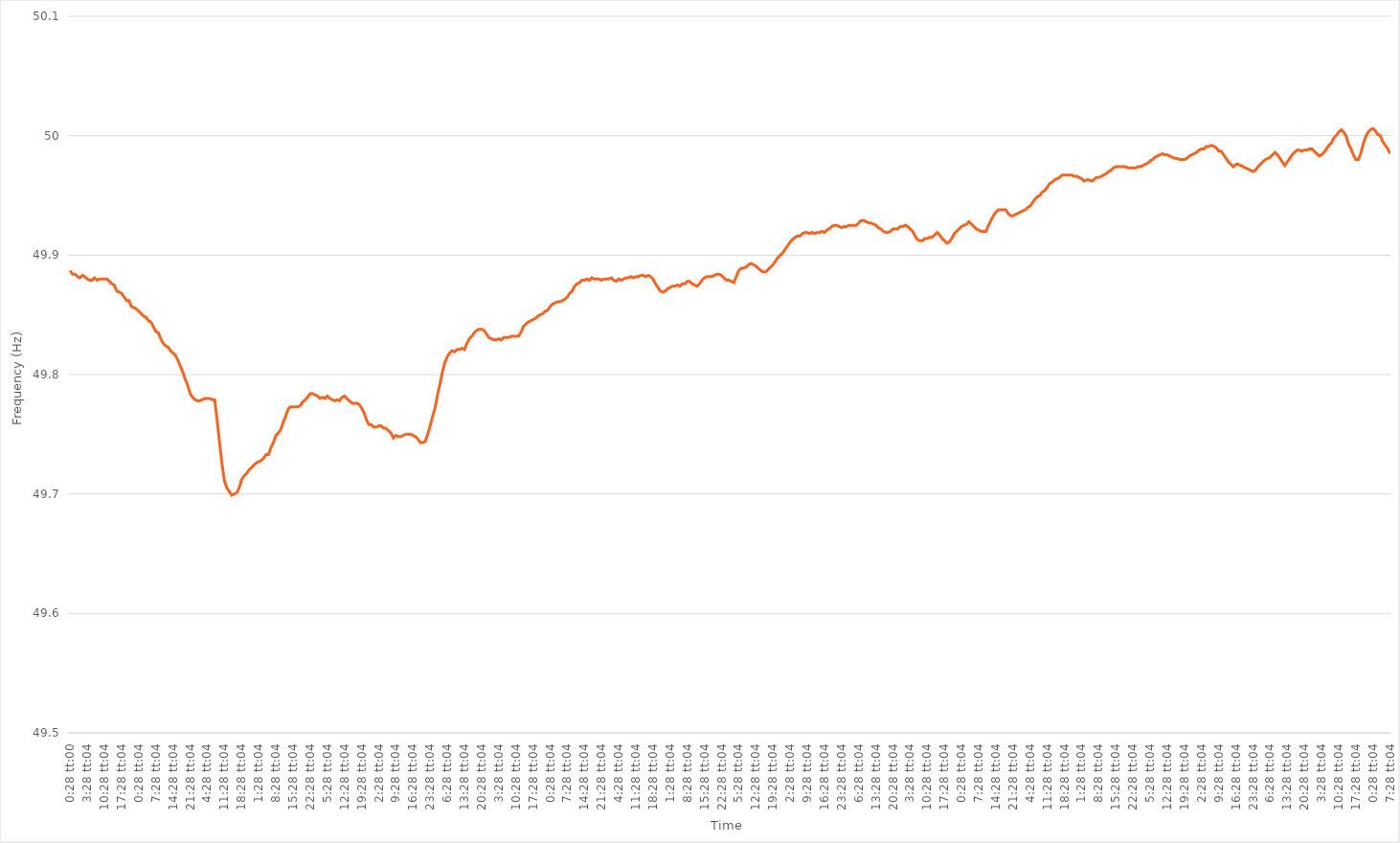
| Category | Series 0 |
|---|---|
| 0.019444444444444445 | 49.887 |
| 0.01945601851851852 | 49.884 |
| 0.019467592592592595 | 49.884 |
| 0.01947916666666667 | 49.882 |
| 0.019490740740740743 | 49.881 |
| 0.0611574074074074 | 49.883 |
| 0.102824074074074 | 49.882 |
| 0.144490740740741 | 49.88 |
| 0.186157407407407 | 49.879 |
| 0.227824074074074 | 49.879 |
| 0.269490740740741 | 49.881 |
| 0.311157407407407 | 49.879 |
| 0.352824074074074 | 49.88 |
| 0.394490740740741 | 49.88 |
| 0.436157407407407 | 49.88 |
| 0.477824074074074 | 49.88 |
| 0.519490740740741 | 49.878 |
| 0.561157407407407 | 49.876 |
| 0.602824074074074 | 49.875 |
| 0.644490740740741 | 49.87 |
| 0.686157407407407 | 49.869 |
| 0.727824074074074 | 49.868 |
| 0.769490740740741 | 49.865 |
| 0.811157407407407 | 49.862 |
| 0.852824074074074 | 49.862 |
| 0.894490740740741 | 49.857 |
| 0.936157407407407 | 49.856 |
| 0.977824074074074 | 49.855 |
| 1900-01-01 00:28:04 | 49.853 |
| 1900-01-01 01:28:04 | 49.851 |
| 1900-01-01 02:28:04 | 49.849 |
| 1900-01-01 03:28:04 | 49.848 |
| 1900-01-01 04:28:04 | 49.845 |
| 1900-01-01 05:28:04 | 49.844 |
| 1900-01-01 06:28:04 | 49.84 |
| 1900-01-01 07:28:04 | 49.836 |
| 1900-01-01 08:28:04 | 49.835 |
| 1900-01-01 09:28:04 | 49.83 |
| 1900-01-01 10:28:04 | 49.826 |
| 1900-01-01 11:28:04 | 49.824 |
| 1900-01-01 12:28:04 | 49.823 |
| 1900-01-01 13:28:04 | 49.82 |
| 1900-01-01 14:28:04 | 49.818 |
| 1900-01-01 15:28:04 | 49.816 |
| 1900-01-01 16:28:04 | 49.812 |
| 1900-01-01 17:28:04 | 49.807 |
| 1900-01-01 18:28:04 | 49.802 |
| 1900-01-01 19:28:04 | 49.796 |
| 1900-01-01 20:28:04 | 49.791 |
| 1900-01-01 21:28:04 | 49.784 |
| 1900-01-01 22:28:04 | 49.781 |
| 1900-01-01 23:28:04 | 49.779 |
| 1900-01-02 00:28:04 | 49.778 |
| 1900-01-02 01:28:04 | 49.778 |
| 1900-01-02 02:28:04 | 49.779 |
| 1900-01-02 03:28:04 | 49.78 |
| 1900-01-02 04:28:04 | 49.78 |
| 1900-01-02 05:28:04 | 49.78 |
| 1900-01-02 06:28:04 | 49.779 |
| 1900-01-02 07:28:04 | 49.779 |
| 1900-01-02 08:28:04 | 49.762 |
| 1900-01-02 09:28:04 | 49.743 |
| 1900-01-02 10:28:04 | 49.725 |
| 1900-01-02 11:28:04 | 49.711 |
| 1900-01-02 12:28:04 | 49.705 |
| 1900-01-02 13:28:04 | 49.702 |
| 1900-01-02 14:28:04 | 49.699 |
| 1900-01-02 15:28:04 | 49.7 |
| 1900-01-02 16:28:04 | 49.701 |
| 1900-01-02 17:28:04 | 49.705 |
| 1900-01-02 18:28:04 | 49.712 |
| 1900-01-02 19:28:04 | 49.715 |
| 1900-01-02 20:28:04 | 49.717 |
| 1900-01-02 21:28:04 | 49.72 |
| 1900-01-02 22:28:04 | 49.722 |
| 1900-01-02 23:28:04 | 49.724 |
| 1900-01-03 00:28:04 | 49.726 |
| 1900-01-03 01:28:04 | 49.727 |
| 1900-01-03 02:28:04 | 49.728 |
| 1900-01-03 03:28:04 | 49.73 |
| 1900-01-03 04:28:04 | 49.733 |
| 1900-01-03 05:28:04 | 49.733 |
| 1900-01-03 06:28:04 | 49.739 |
| 1900-01-03 07:28:04 | 49.743 |
| 1900-01-03 08:28:04 | 49.749 |
| 1900-01-03 09:28:04 | 49.751 |
| 1900-01-03 10:28:04 | 49.754 |
| 1900-01-03 11:28:04 | 49.76 |
| 1900-01-03 12:28:04 | 49.765 |
| 1900-01-03 13:28:04 | 49.771 |
| 1900-01-03 14:28:04 | 49.773 |
| 1900-01-03 15:28:04 | 49.773 |
| 1900-01-03 16:28:04 | 49.773 |
| 1900-01-03 17:28:04 | 49.773 |
| 1900-01-03 18:28:04 | 49.774 |
| 1900-01-03 19:28:04 | 49.777 |
| 1900-01-03 20:28:04 | 49.779 |
| 1900-01-03 21:28:04 | 49.781 |
| 1900-01-03 22:28:04 | 49.784 |
| 1900-01-03 23:28:04 | 49.784 |
| 1900-01-04 00:28:04 | 49.783 |
| 1900-01-04 01:28:04 | 49.782 |
| 1900-01-04 02:28:04 | 49.78 |
| 1900-01-04 03:28:04 | 49.781 |
| 1900-01-04 04:28:04 | 49.78 |
| 1900-01-04 05:28:04 | 49.782 |
| 1900-01-04 06:28:04 | 49.78 |
| 1900-01-04 07:28:04 | 49.779 |
| 1900-01-04 08:28:04 | 49.778 |
| 1900-01-04 09:28:04 | 49.779 |
| 1900-01-04 10:28:04 | 49.778 |
| 1900-01-04 11:28:04 | 49.781 |
| 1900-01-04 12:28:04 | 49.782 |
| 1900-01-04 13:28:04 | 49.78 |
| 1900-01-04 14:28:04 | 49.778 |
| 1900-01-04 15:28:04 | 49.776 |
| 1900-01-04 16:28:04 | 49.776 |
| 1900-01-04 17:28:04 | 49.776 |
| 1900-01-04 18:28:04 | 49.775 |
| 1900-01-04 19:28:04 | 49.772 |
| 1900-01-04 20:28:04 | 49.768 |
| 1900-01-04 21:28:04 | 49.762 |
| 1900-01-04 22:28:04 | 49.758 |
| 1900-01-04 23:28:04 | 49.758 |
| 1900-01-05 00:28:04 | 49.756 |
| 1900-01-05 01:28:04 | 49.756 |
| 1900-01-05 02:28:04 | 49.757 |
| 1900-01-05 03:28:04 | 49.757 |
| 1900-01-05 04:28:04 | 49.755 |
| 1900-01-05 05:28:04 | 49.755 |
| 1900-01-05 06:28:04 | 49.753 |
| 1900-01-05 07:28:04 | 49.751 |
| 1900-01-05 08:28:04 | 49.747 |
| 1900-01-05 09:28:04 | 49.749 |
| 1900-01-05 10:28:04 | 49.748 |
| 1900-01-05 11:28:04 | 49.748 |
| 1900-01-05 12:28:04 | 49.749 |
| 1900-01-05 13:28:04 | 49.75 |
| 1900-01-05 14:28:04 | 49.75 |
| 1900-01-05 15:28:04 | 49.75 |
| 1900-01-05 16:28:04 | 49.749 |
| 1900-01-05 17:28:04 | 49.748 |
| 1900-01-05 18:28:04 | 49.746 |
| 1900-01-05 19:28:04 | 49.743 |
| 1900-01-05 20:28:04 | 49.743 |
| 1900-01-05 21:28:04 | 49.744 |
| 1900-01-05 22:28:04 | 49.75 |
| 1900-01-05 23:28:04 | 49.757 |
| 1900-01-06 00:28:04 | 49.765 |
| 1900-01-06 01:28:04 | 49.772 |
| 1900-01-06 02:28:04 | 49.783 |
| 1900-01-06 03:28:04 | 49.792 |
| 1900-01-06 04:28:04 | 49.802 |
| 1900-01-06 05:28:04 | 49.81 |
| 1900-01-06 06:28:04 | 49.815 |
| 1900-01-06 07:28:04 | 49.818 |
| 1900-01-06 08:28:04 | 49.82 |
| 1900-01-06 09:28:04 | 49.819 |
| 1900-01-06 10:28:04 | 49.821 |
| 1900-01-06 11:28:04 | 49.821 |
| 1900-01-06 12:28:04 | 49.822 |
| 1900-01-06 13:28:04 | 49.821 |
| 1900-01-06 14:28:04 | 49.826 |
| 1900-01-06 15:28:04 | 49.83 |
| 1900-01-06 16:28:04 | 49.832 |
| 1900-01-06 17:28:04 | 49.835 |
| 1900-01-06 18:28:04 | 49.837 |
| 1900-01-06 19:28:04 | 49.838 |
| 1900-01-06 20:28:04 | 49.838 |
| 1900-01-06 21:28:04 | 49.837 |
| 1900-01-06 22:28:04 | 49.834 |
| 1900-01-06 23:28:04 | 49.831 |
| 1900-01-07 00:28:04 | 49.83 |
| 1900-01-07 01:28:04 | 49.829 |
| 1900-01-07 02:28:04 | 49.829 |
| 1900-01-07 03:28:04 | 49.83 |
| 1900-01-07 04:28:04 | 49.829 |
| 1900-01-07 05:28:04 | 49.831 |
| 1900-01-07 06:28:04 | 49.831 |
| 1900-01-07 07:28:04 | 49.831 |
| 1900-01-07 08:28:04 | 49.832 |
| 1900-01-07 09:28:04 | 49.832 |
| 1900-01-07 10:28:04 | 49.832 |
| 1900-01-07 11:28:04 | 49.832 |
| 1900-01-07 12:28:04 | 49.835 |
| 1900-01-07 13:28:04 | 49.84 |
| 1900-01-07 14:28:04 | 49.842 |
| 1900-01-07 15:28:04 | 49.844 |
| 1900-01-07 16:28:04 | 49.845 |
| 1900-01-07 17:28:04 | 49.846 |
| 1900-01-07 18:28:04 | 49.847 |
| 1900-01-07 19:28:04 | 49.849 |
| 1900-01-07 20:28:04 | 49.85 |
| 1900-01-07 21:28:04 | 49.851 |
| 1900-01-07 22:28:04 | 49.853 |
| 1900-01-07 23:28:04 | 49.854 |
| 1900-01-08 00:28:04 | 49.857 |
| 1900-01-08 01:28:04 | 49.859 |
| 1900-01-08 02:28:04 | 49.86 |
| 1900-01-08 03:28:04 | 49.861 |
| 1900-01-08 04:28:04 | 49.861 |
| 1900-01-08 05:28:04 | 49.862 |
| 1900-01-08 06:28:04 | 49.863 |
| 1900-01-08 07:28:04 | 49.865 |
| 1900-01-08 08:28:04 | 49.868 |
| 1900-01-08 09:28:04 | 49.87 |
| 1900-01-08 10:28:04 | 49.874 |
| 1900-01-08 11:28:04 | 49.876 |
| 1900-01-08 12:28:04 | 49.877 |
| 1900-01-08 13:28:04 | 49.879 |
| 1900-01-08 14:28:04 | 49.879 |
| 1900-01-08 15:28:04 | 49.88 |
| 1900-01-08 16:28:04 | 49.879 |
| 1900-01-08 17:28:04 | 49.881 |
| 1900-01-08 18:28:04 | 49.88 |
| 1900-01-08 19:28:04 | 49.88 |
| 1900-01-08 20:28:04 | 49.88 |
| 1900-01-08 21:28:04 | 49.879 |
| 1900-01-08 22:28:04 | 49.88 |
| 1900-01-08 23:28:04 | 49.88 |
| 1900-01-09 00:28:04 | 49.88 |
| 1900-01-09 01:28:04 | 49.881 |
| 1900-01-09 02:28:04 | 49.879 |
| 1900-01-09 03:28:04 | 49.878 |
| 1900-01-09 04:28:04 | 49.88 |
| 1900-01-09 05:28:04 | 49.879 |
| 1900-01-09 06:28:04 | 49.88 |
| 1900-01-09 07:28:04 | 49.881 |
| 1900-01-09 08:28:04 | 49.881 |
| 1900-01-09 09:28:04 | 49.882 |
| 1900-01-09 10:28:04 | 49.881 |
| 1900-01-09 11:28:04 | 49.882 |
| 1900-01-09 12:28:04 | 49.882 |
| 1900-01-09 13:28:04 | 49.883 |
| 1900-01-09 14:28:04 | 49.883 |
| 1900-01-09 15:28:04 | 49.882 |
| 1900-01-09 16:28:04 | 49.883 |
| 1900-01-09 17:28:04 | 49.882 |
| 1900-01-09 18:28:04 | 49.88 |
| 1900-01-09 19:28:04 | 49.876 |
| 1900-01-09 20:28:04 | 49.873 |
| 1900-01-09 21:28:04 | 49.87 |
| 1900-01-09 22:28:04 | 49.869 |
| 1900-01-09 23:28:04 | 49.87 |
| 1900-01-10 00:28:04 | 49.872 |
| 1900-01-10 01:28:04 | 49.873 |
| 1900-01-10 02:28:04 | 49.874 |
| 1900-01-10 03:28:04 | 49.874 |
| 1900-01-10 04:28:04 | 49.875 |
| 1900-01-10 05:28:04 | 49.874 |
| 1900-01-10 06:28:04 | 49.876 |
| 1900-01-10 07:28:04 | 49.876 |
| 1900-01-10 08:28:04 | 49.878 |
| 1900-01-10 09:28:04 | 49.878 |
| 1900-01-10 10:28:04 | 49.876 |
| 1900-01-10 11:28:04 | 49.875 |
| 1900-01-10 12:28:04 | 49.874 |
| 1900-01-10 13:28:04 | 49.876 |
| 1900-01-10 14:28:04 | 49.879 |
| 1900-01-10 15:28:04 | 49.881 |
| 1900-01-10 16:28:04 | 49.882 |
| 1900-01-10 17:28:04 | 49.882 |
| 1900-01-10 18:28:04 | 49.882 |
| 1900-01-10 19:28:04 | 49.883 |
| 1900-01-10 20:28:04 | 49.884 |
| 1900-01-10 21:28:04 | 49.884 |
| 1900-01-10 22:28:04 | 49.883 |
| 1900-01-10 23:28:04 | 49.881 |
| 1900-01-11 00:28:04 | 49.879 |
| 1900-01-11 01:28:04 | 49.879 |
| 1900-01-11 02:28:04 | 49.878 |
| 1900-01-11 03:28:04 | 49.877 |
| 1900-01-11 04:28:04 | 49.882 |
| 1900-01-11 05:28:04 | 49.887 |
| 1900-01-11 06:28:04 | 49.889 |
| 1900-01-11 07:28:04 | 49.889 |
| 1900-01-11 08:28:04 | 49.89 |
| 1900-01-11 09:28:04 | 49.892 |
| 1900-01-11 10:28:04 | 49.893 |
| 1900-01-11 11:28:04 | 49.892 |
| 1900-01-11 12:28:04 | 49.891 |
| 1900-01-11 13:28:04 | 49.889 |
| 1900-01-11 14:28:04 | 49.887 |
| 1900-01-11 15:28:04 | 49.886 |
| 1900-01-11 16:28:04 | 49.886 |
| 1900-01-11 17:28:04 | 49.888 |
| 1900-01-11 18:28:04 | 49.89 |
| 1900-01-11 19:28:04 | 49.892 |
| 1900-01-11 20:28:04 | 49.895 |
| 1900-01-11 21:28:04 | 49.898 |
| 1900-01-11 22:28:04 | 49.9 |
| 1900-01-11 23:28:04 | 49.902 |
| 1900-01-12 00:28:04 | 49.905 |
| 1900-01-12 01:28:04 | 49.908 |
| 1900-01-12 02:28:04 | 49.911 |
| 1900-01-12 03:28:04 | 49.913 |
| 1900-01-12 04:28:04 | 49.915 |
| 1900-01-12 05:28:04 | 49.916 |
| 1900-01-12 06:28:04 | 49.916 |
| 1900-01-12 07:28:04 | 49.918 |
| 1900-01-12 08:28:04 | 49.919 |
| 1900-01-12 09:28:04 | 49.919 |
| 1900-01-12 10:28:04 | 49.918 |
| 1900-01-12 11:28:04 | 49.919 |
| 1900-01-12 12:28:04 | 49.918 |
| 1900-01-12 13:28:04 | 49.919 |
| 1900-01-12 14:28:04 | 49.919 |
| 1900-01-12 15:28:04 | 49.92 |
| 1900-01-12 16:28:04 | 49.919 |
| 1900-01-12 17:28:04 | 49.921 |
| 1900-01-12 18:28:04 | 49.922 |
| 1900-01-12 19:28:04 | 49.924 |
| 1900-01-12 20:28:04 | 49.925 |
| 1900-01-12 21:28:04 | 49.925 |
| 1900-01-12 22:28:04 | 49.924 |
| 1900-01-12 23:28:04 | 49.923 |
| 1900-01-13 00:28:04 | 49.924 |
| 1900-01-13 01:28:04 | 49.924 |
| 1900-01-13 02:28:04 | 49.925 |
| 1900-01-13 03:28:04 | 49.925 |
| 1900-01-13 04:28:04 | 49.925 |
| 1900-01-13 05:28:04 | 49.925 |
| 1900-01-13 06:28:04 | 49.927 |
| 1900-01-13 07:28:04 | 49.929 |
| 1900-01-13 08:28:04 | 49.929 |
| 1900-01-13 09:28:04 | 49.928 |
| 1900-01-13 10:28:04 | 49.927 |
| 1900-01-13 11:28:04 | 49.927 |
| 1900-01-13 12:28:04 | 49.926 |
| 1900-01-13 13:28:04 | 49.925 |
| 1900-01-13 14:28:04 | 49.923 |
| 1900-01-13 15:28:04 | 49.922 |
| 1900-01-13 16:28:04 | 49.92 |
| 1900-01-13 17:28:04 | 49.919 |
| 1900-01-13 18:28:04 | 49.919 |
| 1900-01-13 19:28:04 | 49.92 |
| 1900-01-13 20:28:04 | 49.922 |
| 1900-01-13 21:28:04 | 49.922 |
| 1900-01-13 22:28:04 | 49.922 |
| 1900-01-13 23:28:04 | 49.924 |
| 1900-01-14 00:28:04 | 49.924 |
| 1900-01-14 01:28:04 | 49.925 |
| 1900-01-14 02:28:04 | 49.924 |
| 1900-01-14 03:28:04 | 49.922 |
| 1900-01-14 04:28:04 | 49.92 |
| 1900-01-14 05:28:04 | 49.916 |
| 1900-01-14 06:28:04 | 49.913 |
| 1900-01-14 07:28:04 | 49.912 |
| 1900-01-14 08:28:04 | 49.912 |
| 1900-01-14 09:28:04 | 49.914 |
| 1900-01-14 10:28:04 | 49.914 |
| 1900-01-14 11:28:04 | 49.915 |
| 1900-01-14 12:28:04 | 49.915 |
| 1900-01-14 13:28:04 | 49.917 |
| 1900-01-14 14:28:04 | 49.919 |
| 1900-01-14 15:28:04 | 49.917 |
| 1900-01-14 16:28:04 | 49.914 |
| 1900-01-14 17:28:04 | 49.912 |
| 1900-01-14 18:28:04 | 49.91 |
| 1900-01-14 19:28:04 | 49.911 |
| 1900-01-14 20:28:04 | 49.914 |
| 1900-01-14 21:28:04 | 49.918 |
| 1900-01-14 22:28:04 | 49.92 |
| 1900-01-14 23:28:04 | 49.922 |
| 1900-01-15 00:28:04 | 49.924 |
| 1900-01-15 01:28:04 | 49.925 |
| 1900-01-15 02:28:04 | 49.926 |
| 1900-01-15 03:28:04 | 49.928 |
| 1900-01-15 04:28:04 | 49.926 |
| 1900-01-15 05:28:04 | 49.924 |
| 1900-01-15 06:28:04 | 49.922 |
| 1900-01-15 07:28:04 | 49.921 |
| 1900-01-15 08:28:04 | 49.92 |
| 1900-01-15 09:28:04 | 49.92 |
| 1900-01-15 10:28:04 | 49.92 |
| 1900-01-15 11:28:04 | 49.925 |
| 1900-01-15 12:28:04 | 49.929 |
| 1900-01-15 13:28:04 | 49.933 |
| 1900-01-15 14:28:04 | 49.936 |
| 1900-01-15 15:28:04 | 49.938 |
| 1900-01-15 16:28:04 | 49.938 |
| 1900-01-15 17:28:04 | 49.938 |
| 1900-01-15 18:28:04 | 49.938 |
| 1900-01-15 19:28:04 | 49.935 |
| 1900-01-15 20:28:04 | 49.933 |
| 1900-01-15 21:28:04 | 49.933 |
| 1900-01-15 22:28:04 | 49.934 |
| 1900-01-15 23:28:04 | 49.935 |
| 1900-01-16 00:28:04 | 49.936 |
| 1900-01-16 01:28:04 | 49.937 |
| 1900-01-16 02:28:04 | 49.938 |
| 1900-01-16 03:28:04 | 49.94 |
| 1900-01-16 04:28:04 | 49.941 |
| 1900-01-16 05:28:04 | 49.944 |
| 1900-01-16 06:28:04 | 49.947 |
| 1900-01-16 07:28:04 | 49.949 |
| 1900-01-16 08:28:04 | 49.95 |
| 1900-01-16 09:28:04 | 49.953 |
| 1900-01-16 10:28:04 | 49.954 |
| 1900-01-16 11:28:04 | 49.957 |
| 1900-01-16 12:28:04 | 49.96 |
| 1900-01-16 13:28:04 | 49.961 |
| 1900-01-16 14:28:04 | 49.963 |
| 1900-01-16 15:28:04 | 49.964 |
| 1900-01-16 16:28:04 | 49.965 |
| 1900-01-16 17:28:04 | 49.967 |
| 1900-01-16 18:28:04 | 49.967 |
| 1900-01-16 19:28:04 | 49.967 |
| 1900-01-16 20:28:04 | 49.967 |
| 1900-01-16 21:28:04 | 49.967 |
| 1900-01-16 22:28:04 | 49.966 |
| 1900-01-16 23:28:04 | 49.966 |
| 1900-01-17 00:28:04 | 49.965 |
| 1900-01-17 01:28:04 | 49.964 |
| 1900-01-17 02:28:04 | 49.962 |
| 1900-01-17 03:28:04 | 49.963 |
| 1900-01-17 04:28:04 | 49.963 |
| 1900-01-17 05:28:04 | 49.962 |
| 1900-01-17 06:28:04 | 49.963 |
| 1900-01-17 07:28:04 | 49.965 |
| 1900-01-17 08:28:04 | 49.965 |
| 1900-01-17 09:28:04 | 49.966 |
| 1900-01-17 10:28:04 | 49.967 |
| 1900-01-17 11:28:04 | 49.968 |
| 1900-01-17 12:28:04 | 49.97 |
| 1900-01-17 13:28:04 | 49.971 |
| 1900-01-17 14:28:04 | 49.973 |
| 1900-01-17 15:28:04 | 49.974 |
| 1900-01-17 16:28:04 | 49.974 |
| 1900-01-17 17:28:04 | 49.974 |
| 1900-01-17 18:28:04 | 49.974 |
| 1900-01-17 19:28:04 | 49.974 |
| 1900-01-17 20:28:04 | 49.973 |
| 1900-01-17 21:28:04 | 49.973 |
| 1900-01-17 22:28:04 | 49.973 |
| 1900-01-17 23:28:04 | 49.973 |
| 1900-01-18 00:28:04 | 49.974 |
| 1900-01-18 01:28:04 | 49.974 |
| 1900-01-18 02:28:04 | 49.975 |
| 1900-01-18 03:28:04 | 49.976 |
| 1900-01-18 04:28:04 | 49.977 |
| 1900-01-18 05:28:04 | 49.979 |
| 1900-01-18 06:28:04 | 49.98 |
| 1900-01-18 07:28:04 | 49.982 |
| 1900-01-18 08:28:04 | 49.983 |
| 1900-01-18 09:28:04 | 49.984 |
| 1900-01-18 10:28:04 | 49.985 |
| 1900-01-18 11:28:04 | 49.984 |
| 1900-01-18 12:28:04 | 49.984 |
| 1900-01-18 13:28:04 | 49.983 |
| 1900-01-18 14:28:04 | 49.982 |
| 1900-01-18 15:28:04 | 49.981 |
| 1900-01-18 16:28:04 | 49.981 |
| 1900-01-18 17:28:04 | 49.98 |
| 1900-01-18 18:28:04 | 49.98 |
| 1900-01-18 19:28:04 | 49.98 |
| 1900-01-18 20:28:04 | 49.981 |
| 1900-01-18 21:28:04 | 49.983 |
| 1900-01-18 22:28:04 | 49.984 |
| 1900-01-18 23:28:04 | 49.985 |
| 1900-01-19 00:28:04 | 49.986 |
| 1900-01-19 01:28:04 | 49.988 |
| 1900-01-19 02:28:04 | 49.989 |
| 1900-01-19 03:28:04 | 49.989 |
| 1900-01-19 04:28:04 | 49.991 |
| 1900-01-19 05:28:04 | 49.991 |
| 1900-01-19 06:28:04 | 49.992 |
| 1900-01-19 07:28:04 | 49.991 |
| 1900-01-19 08:28:04 | 49.99 |
| 1900-01-19 09:28:04 | 49.987 |
| 1900-01-19 10:28:04 | 49.987 |
| 1900-01-19 11:28:04 | 49.984 |
| 1900-01-19 12:28:04 | 49.981 |
| 1900-01-19 13:28:04 | 49.978 |
| 1900-01-19 14:28:04 | 49.976 |
| 1900-01-19 15:28:04 | 49.974 |
| 1900-01-19 16:28:04 | 49.976 |
| 1900-01-19 17:28:04 | 49.976 |
| 1900-01-19 18:28:04 | 49.975 |
| 1900-01-19 19:28:04 | 49.974 |
| 1900-01-19 20:28:04 | 49.973 |
| 1900-01-19 21:28:04 | 49.972 |
| 1900-01-19 22:28:04 | 49.971 |
| 1900-01-19 23:28:04 | 49.97 |
| 1900-01-20 00:28:04 | 49.971 |
| 1900-01-20 01:28:04 | 49.974 |
| 1900-01-20 02:28:04 | 49.976 |
| 1900-01-20 03:28:04 | 49.978 |
| 1900-01-20 04:28:04 | 49.98 |
| 1900-01-20 05:28:04 | 49.981 |
| 1900-01-20 06:28:04 | 49.982 |
| 1900-01-20 07:28:04 | 49.984 |
| 1900-01-20 08:28:04 | 49.986 |
| 1900-01-20 09:28:04 | 49.984 |
| 1900-01-20 10:28:04 | 49.981 |
| 1900-01-20 11:28:04 | 49.978 |
| 1900-01-20 12:28:04 | 49.975 |
| 1900-01-20 13:28:04 | 49.978 |
| 1900-01-20 14:28:04 | 49.981 |
| 1900-01-20 15:28:04 | 49.984 |
| 1900-01-20 16:28:04 | 49.986 |
| 1900-01-20 17:28:04 | 49.988 |
| 1900-01-20 18:28:04 | 49.988 |
| 1900-01-20 19:28:04 | 49.987 |
| 1900-01-20 20:28:04 | 49.988 |
| 1900-01-20 21:28:04 | 49.988 |
| 1900-01-20 22:28:04 | 49.989 |
| 1900-01-20 23:28:04 | 49.989 |
| 1900-01-21 00:28:04 | 49.987 |
| 1900-01-21 01:28:04 | 49.985 |
| 1900-01-21 02:28:04 | 49.983 |
| 1900-01-21 03:28:04 | 49.984 |
| 1900-01-21 04:28:04 | 49.986 |
| 1900-01-21 05:28:04 | 49.989 |
| 1900-01-21 06:28:04 | 49.992 |
| 1900-01-21 07:28:04 | 49.994 |
| 1900-01-21 08:28:04 | 49.998 |
| 1900-01-21 09:28:04 | 50 |
| 1900-01-21 10:28:04 | 50.003 |
| 1900-01-21 11:28:04 | 50.005 |
| 1900-01-21 12:28:04 | 50.003 |
| 1900-01-21 13:28:04 | 50 |
| 1900-01-21 14:28:04 | 49.993 |
| 1900-01-21 15:28:04 | 49.989 |
| 1900-01-21 16:28:04 | 49.984 |
| 1900-01-21 17:28:04 | 49.98 |
| 1900-01-21 18:28:04 | 49.98 |
| 1900-01-21 19:28:04 | 49.985 |
| 1900-01-21 20:28:04 | 49.993 |
| 1900-01-21 21:28:04 | 49.999 |
| 1900-01-21 22:28:04 | 50.003 |
| 1900-01-21 23:28:04 | 50.005 |
| 1900-01-22 00:28:04 | 50.006 |
| 1900-01-22 01:28:04 | 50.004 |
| 1900-01-22 02:28:04 | 50.001 |
| 1900-01-22 03:28:04 | 50 |
| 1900-01-22 04:28:04 | 49.995 |
| 1900-01-22 05:28:04 | 49.992 |
| 1900-01-22 06:28:04 | 49.989 |
| 1900-01-22 07:28:04 | 49.985 |